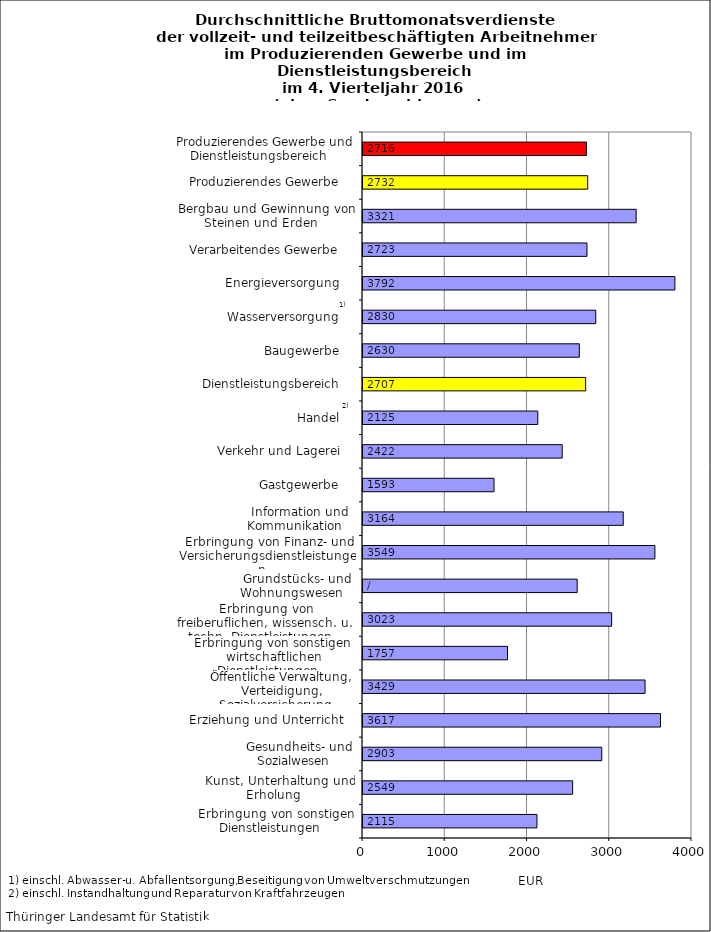
| Category | Series 0 |
|---|---|
| Erbringung von sonstigen Dienstleistungen    | 2115 |
| Kunst, Unterhaltung und Erholung    | 2549 |
| Gesundheits- und Sozialwesen    | 2903 |
| Erziehung und Unterricht    | 3617 |
| Öffentliche Verwaltung, Verteidigung, Sozialversicherung    | 3429 |
| Erbringung von sonstigen  wirtschaftlichen Dienstleistungen    | 1757 |
| Erbringung von freiberuflichen, wissensch. u. techn. Dienstleistungen    | 3023 |
| Grundstücks- und Wohnungswesen    | 2604 |
| Erbringung von Finanz- und Versicherungsdienstleistungen    | 3549 |
| Information und Kommunikation    | 3164 |
| Gastgewerbe    | 1593 |
| Verkehr und Lagerei    | 2422 |
| Handel    | 2125 |
| Dienstleistungsbereich    | 2707 |
| Baugewerbe    | 2630 |
| Wasserversorgung    | 2830 |
| Energieversorgung    | 3792 |
| Verarbeitendes Gewerbe    | 2723 |
| Bergbau und Gewinnung von Steinen und Erden    | 3321 |
| Produzierendes Gewerbe    | 2732 |
| Produzierendes Gewerbe und Dienstleistungsbereich    | 2716 |